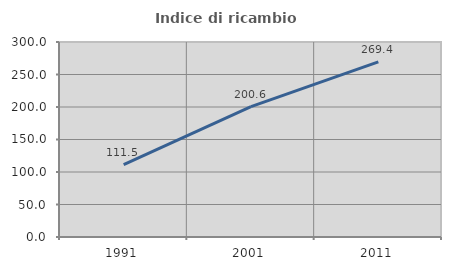
| Category | Indice di ricambio occupazionale  |
|---|---|
| 1991.0 | 111.475 |
| 2001.0 | 200.641 |
| 2011.0 | 269.421 |